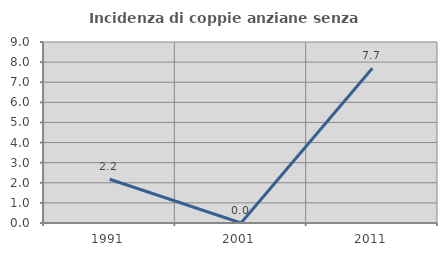
| Category | Incidenza di coppie anziane senza figli  |
|---|---|
| 1991.0 | 2.174 |
| 2001.0 | 0 |
| 2011.0 | 7.692 |